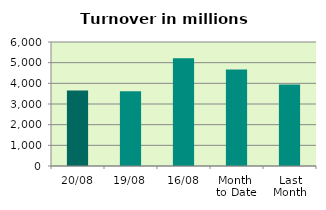
| Category | Series 0 |
|---|---|
| 20/08 | 3647.848 |
| 19/08 | 3613.343 |
| 16/08 | 5212.179 |
| Month 
to Date | 4665.01 |
| Last
Month | 3946.236 |